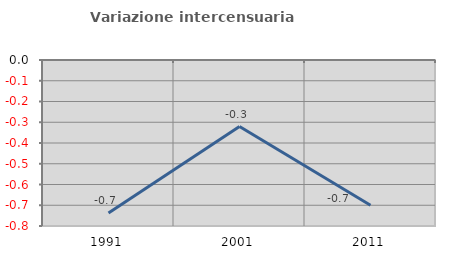
| Category | Variazione intercensuaria annua |
|---|---|
| 1991.0 | -0.737 |
| 2001.0 | -0.321 |
| 2011.0 | -0.7 |